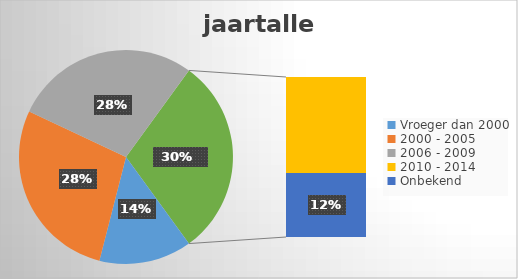
| Category | Series 0 |
|---|---|
| Vroeger dan 2000 | 7 |
| 2000 - 2005 | 14 |
| 2006 - 2009 | 14 |
| 2010 - 2014 | 9 |
| Onbekend  | 6 |